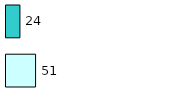
| Category | Series 0 | Series 1 |
|---|---|---|
| 0 | 51 | 24 |